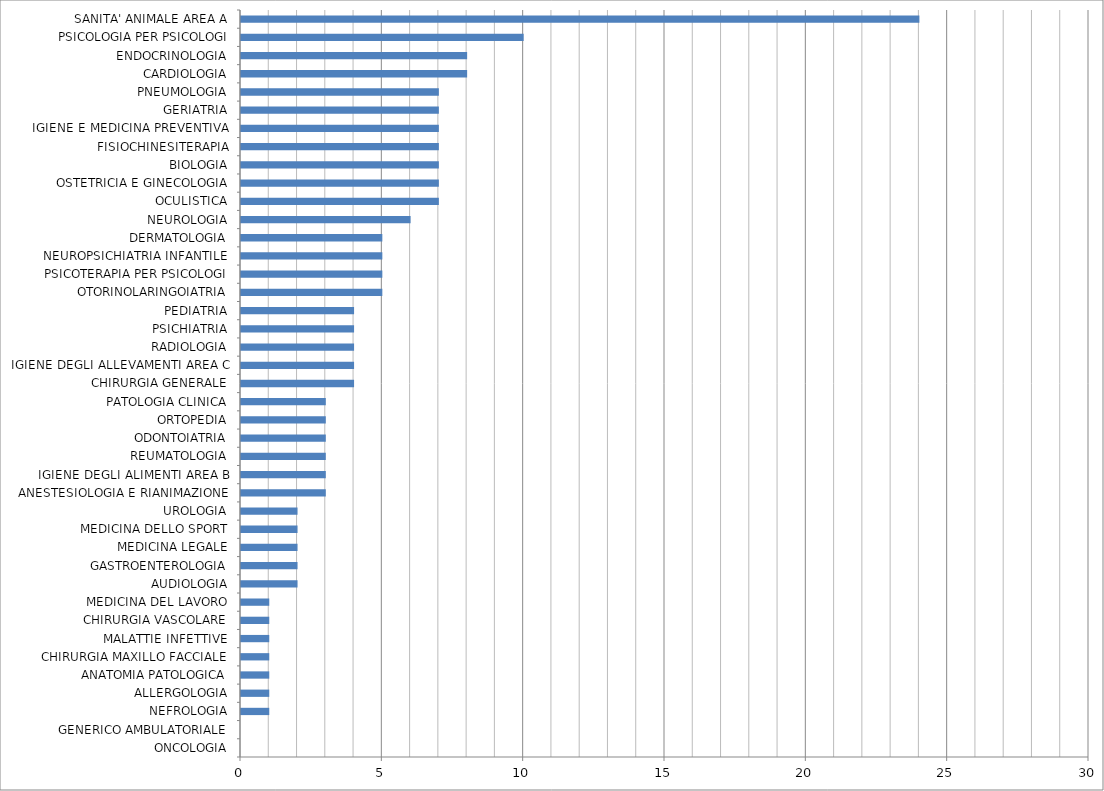
| Category | Series 0 |
|---|---|
| ONCOLOGIA | 0 |
| GENERICO AMBULATORIALE | 0 |
| NEFROLOGIA | 1 |
| ALLERGOLOGIA | 1 |
| ANATOMIA PATOLOGICA | 1 |
| CHIRURGIA MAXILLO FACCIALE | 1 |
| MALATTIE INFETTIVE | 1 |
| CHIRURGIA VASCOLARE | 1 |
| MEDICINA DEL LAVORO | 1 |
| AUDIOLOGIA | 2 |
| GASTROENTEROLOGIA | 2 |
| MEDICINA LEGALE | 2 |
| MEDICINA DELLO SPORT | 2 |
| UROLOGIA | 2 |
| ANESTESIOLOGIA E RIANIMAZIONE | 3 |
| IGIENE DEGLI ALIMENTI AREA B | 3 |
| REUMATOLOGIA | 3 |
| ODONTOIATRIA | 3 |
| ORTOPEDIA | 3 |
| PATOLOGIA CLINICA | 3 |
| CHIRURGIA GENERALE | 4 |
| IGIENE DEGLI ALLEVAMENTI AREA C | 4 |
| RADIOLOGIA | 4 |
| PSICHIATRIA | 4 |
| PEDIATRIA | 4 |
| OTORINOLARINGOIATRIA | 5 |
| PSICOTERAPIA PER PSICOLOGI | 5 |
| NEUROPSICHIATRIA INFANTILE | 5 |
| DERMATOLOGIA | 5 |
| NEUROLOGIA | 6 |
| OCULISTICA | 7 |
| OSTETRICIA E GINECOLOGIA | 7 |
| BIOLOGIA | 7 |
| FISIOCHINESITERAPIA | 7 |
| IGIENE E MEDICINA PREVENTIVA | 7 |
| GERIATRIA | 7 |
| PNEUMOLOGIA | 7 |
| CARDIOLOGIA | 8 |
| ENDOCRINOLOGIA | 8 |
| PSICOLOGIA PER PSICOLOGI | 10 |
| SANITA' ANIMALE AREA A | 24 |